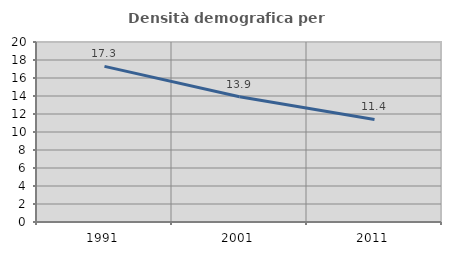
| Category | Densità demografica |
|---|---|
| 1991.0 | 17.289 |
| 2001.0 | 13.911 |
| 2011.0 | 11.393 |